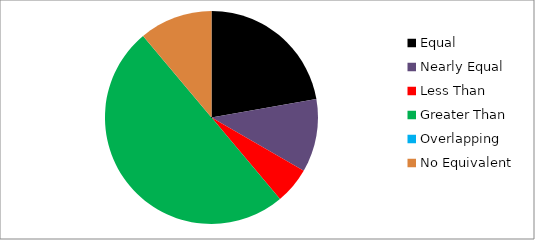
| Category | Series 0 |
|---|---|
| Equal | 4 |
| Nearly Equal | 2 |
| Less Than | 1 |
| Greater Than | 9 |
| Overlapping | 0 |
| No Equivalent | 2 |